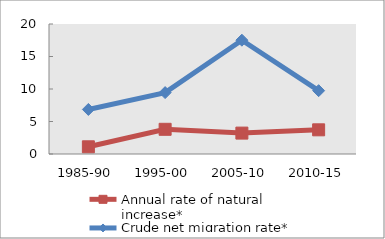
| Category | Annual rate of natural increase* | Crude net migration rate* |
|---|---|---|
| 1985-90 | 1.107 | 6.855 |
| 1995-00 | 3.799 | 9.447 |
| 2005-10 | 3.214 | 17.512 |
| 2010-15 | 3.719 | 9.743 |